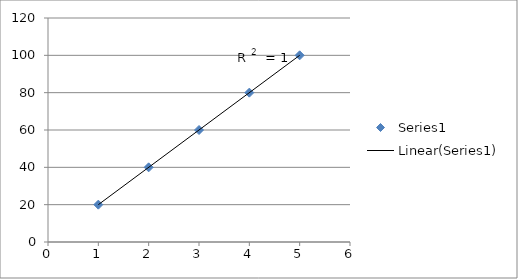
| Category | Series 0 |
|---|---|
| 1.0 | 20 |
| 2.0 | 40 |
| 3.0 | 60 |
| 4.0 | 80 |
| 5.0 | 100 |